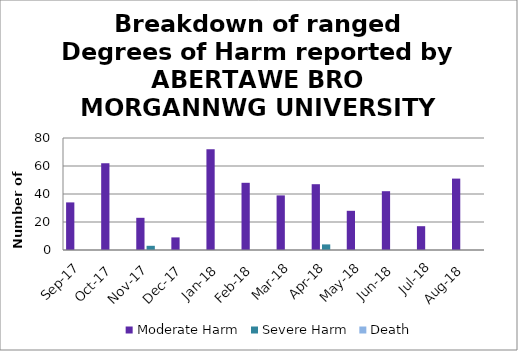
| Category | Moderate Harm | Severe Harm | Death |
|---|---|---|---|
| Sep-17 | 34 | 0 | 0 |
| Oct-17 | 62 | 0 | 0 |
| Nov-17 | 23 | 3 | 0 |
| Dec-17 | 9 | 0 | 0 |
| Jan-18 | 72 | 0 | 0 |
| Feb-18 | 48 | 0 | 0 |
| Mar-18 | 39 | 0 | 0 |
| Apr-18 | 47 | 4 | 0 |
| May-18 | 28 | 0 | 0 |
| Jun-18 | 42 | 0 | 0 |
| Jul-18 | 17 | 0 | 0 |
| Aug-18 | 51 | 0 | 0 |